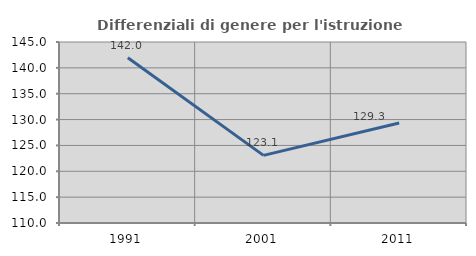
| Category | Differenziali di genere per l'istruzione superiore |
|---|---|
| 1991.0 | 141.955 |
| 2001.0 | 123.071 |
| 2011.0 | 129.322 |